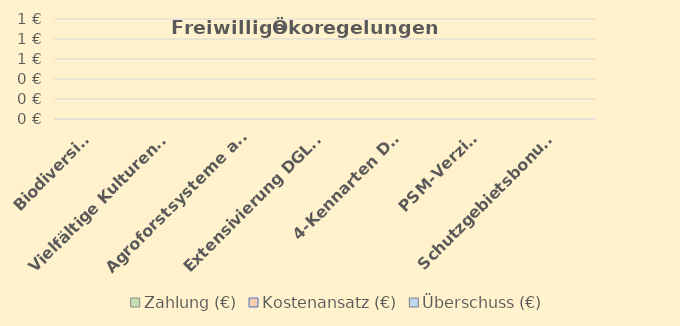
| Category | Zahlung (€) | Kostenansatz (€) | Überschuss (€) |
|---|---|---|---|
| Biodiversität | 0 | 0 | 0 |
| Vielfältige Kulturen im Ackerbau  | 0 | 0 | 0 |
| Agroforstsysteme auf AL und DGL | 0 | 0 | 0 |
| Extensivierung DGL insges. | 0 | 0 | 0 |
| 4-Kennarten DGL | 0 | 0 | 0 |
| PSM-Verzicht | 0 | 0 | 0 |
| Schutzgebietsbonus Natura 2000 | 0 | 0 | 0 |